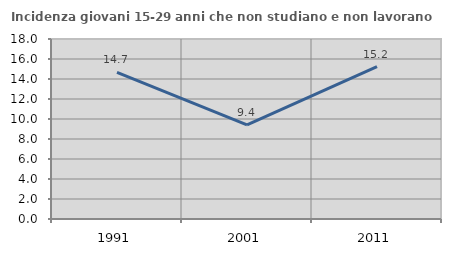
| Category | Incidenza giovani 15-29 anni che non studiano e non lavorano  |
|---|---|
| 1991.0 | 14.671 |
| 2001.0 | 9.409 |
| 2011.0 | 15.245 |